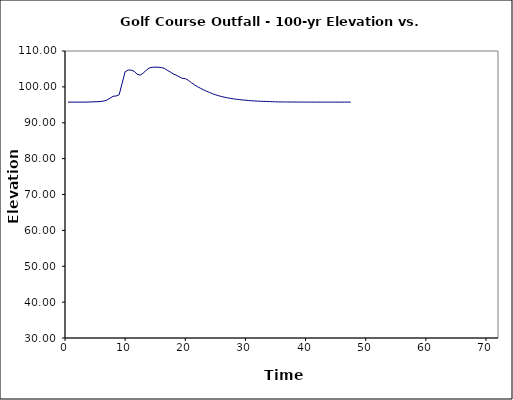
| Category | Time - Flow - Elevation relationship for XS 4656.5 (E127-00-00) |
|---|---|
| 0.5 | 95.75 |
| 1.0 | 95.75 |
| 1.5 | 95.75 |
| 2.0 | 95.75 |
| 2.5 | 95.75 |
| 3.0 | 95.75 |
| 3.5 | 95.758 |
| 4.0 | 95.785 |
| 4.5 | 95.82 |
| 5.0 | 95.849 |
| 5.5 | 95.866 |
| 6.0 | 95.925 |
| 6.5 | 96.08 |
| 7.0 | 96.339 |
| 7.5 | 96.85 |
| 8.0 | 97.373 |
| 8.5 | 97.463 |
| 9.0 | 97.807 |
| 9.5 | 100.981 |
| 10.0 | 104.209 |
| 10.5 | 104.695 |
| 11.0 | 104.668 |
| 11.5 | 104.369 |
| 12.0 | 103.517 |
| 12.5 | 103.272 |
| 13.0 | 103.839 |
| 13.5 | 104.613 |
| 14.0 | 105.255 |
| 14.5 | 105.461 |
| 15.0 | 105.495 |
| 15.5 | 105.482 |
| 16.0 | 105.379 |
| 16.5 | 105.177 |
| 17.0 | 104.633 |
| 17.5 | 104.148 |
| 18.0 | 103.618 |
| 18.5 | 103.255 |
| 19.0 | 102.815 |
| 19.5 | 102.371 |
| 20.0 | 102.296 |
| 20.5 | 101.84 |
| 21.0 | 101.179 |
| 21.5 | 100.619 |
| 22.0 | 100.076 |
| 22.5 | 99.633 |
| 23.0 | 99.21 |
| 23.5 | 98.808 |
| 24.0 | 98.47 |
| 24.5 | 98.114 |
| 25.0 | 97.811 |
| 25.5 | 97.549 |
| 26.0 | 97.318 |
| 26.5 | 97.123 |
| 27.0 | 96.951 |
| 27.5 | 96.801 |
| 28.0 | 96.669 |
| 28.5 | 96.553 |
| 29.0 | 96.451 |
| 29.5 | 96.364 |
| 30.0 | 96.286 |
| 30.5 | 96.204 |
| 31.0 | 96.126 |
| 31.5 | 96.068 |
| 32.0 | 96.028 |
| 32.5 | 95.993 |
| 33.0 | 95.964 |
| 33.5 | 95.934 |
| 34.0 | 95.902 |
| 34.5 | 95.867 |
| 35.0 | 95.834 |
| 35.5 | 95.811 |
| 36.0 | 95.802 |
| 36.5 | 95.793 |
| 37.0 | 95.785 |
| 37.5 | 95.778 |
| 38.0 | 95.774 |
| 38.5 | 95.77 |
| 39.0 | 95.765 |
| 39.5 | 95.761 |
| 40.0 | 95.76 |
| 40.5 | 95.757 |
| 41.0 | 95.754 |
| 41.5 | 95.753 |
| 42.0 | 95.751 |
| 42.5 | 95.751 |
| 43.0 | 95.751 |
| 43.5 | 95.75 |
| 44.0 | 95.75 |
| 44.5 | 95.75 |
| 45.0 | 95.75 |
| 45.5 | 95.75 |
| 46.0 | 95.75 |
| 46.5 | 95.75 |
| 47.0 | 95.75 |
| 47.5 | 95.75 |